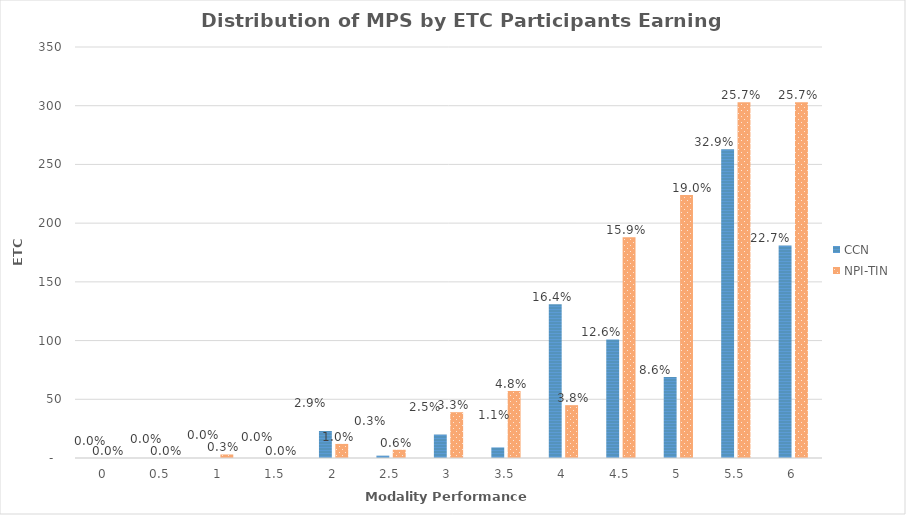
| Category | CCN | NPI-TIN |
|---|---|---|
| 0.0 | 0 | 0 |
| 0.5 | 0 | 0 |
| 1.0 | 0 | 3 |
| 1.5 | 0 | 0 |
| 2.0 | 23 | 12 |
| 2.5 | 2 | 7 |
| 3.0 | 20 | 39 |
| 3.5 | 9 | 57 |
| 4.0 | 131 | 45 |
| 4.5 | 101 | 188 |
| 5.0 | 69 | 224 |
| 5.5 | 263 | 303 |
| 6.0 | 181 | 303 |